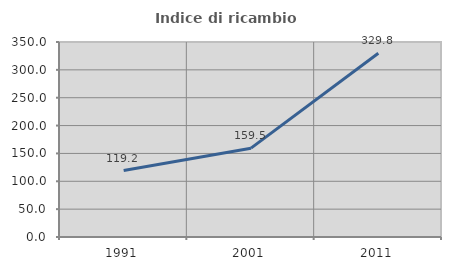
| Category | Indice di ricambio occupazionale  |
|---|---|
| 1991.0 | 119.216 |
| 2001.0 | 159.477 |
| 2011.0 | 329.759 |